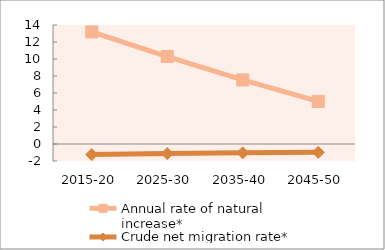
| Category | Annual rate of natural increase* | Crude net migration rate* |
|---|---|---|
| 2015-20 | 13.185 | -1.245 |
| 2025-30 | 10.292 | -1.121 |
| 2035-40 | 7.534 | -1.036 |
| 2045-50 | 5.008 | -0.983 |